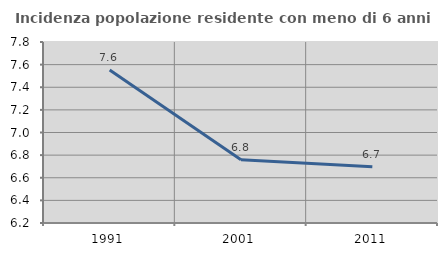
| Category | Incidenza popolazione residente con meno di 6 anni |
|---|---|
| 1991.0 | 7.552 |
| 2001.0 | 6.76 |
| 2011.0 | 6.697 |